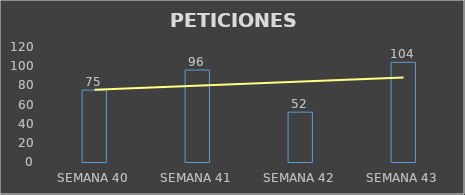
| Category | Series 0 |
|---|---|
| SEMANA 40 | 75 |
| SEMANA 41 | 96 |
| SEMANA 42 | 52 |
| SEMANA 43 | 104 |